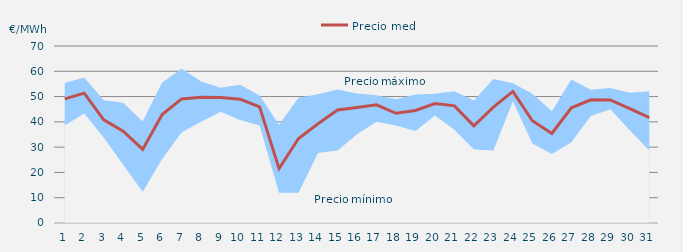
| Category | Precio medio |
|---|---|
| 1.0 | 49.1 |
| 2.0 | 51.364 |
| 3.0 | 40.78 |
| 4.0 | 36.286 |
| 5.0 | 29.111 |
| 6.0 | 42.871 |
| 7.0 | 49.083 |
| 8.0 | 49.733 |
| 9.0 | 49.644 |
| 10.0 | 48.979 |
| 11.0 | 45.943 |
| 12.0 | 21.513 |
| 13.0 | 33.439 |
| 14.0 | 39.231 |
| 15.0 | 44.69 |
| 16.0 | 45.666 |
| 17.0 | 46.754 |
| 18.0 | 43.381 |
| 19.0 | 44.503 |
| 20.0 | 47.212 |
| 21.0 | 46.318 |
| 22.0 | 38.448 |
| 23.0 | 45.802 |
| 24.0 | 52.036 |
| 25.0 | 40.442 |
| 26.0 | 35.396 |
| 27.0 | 45.564 |
| 28.0 | 48.697 |
| 29.0 | 48.676 |
| 30.0 | 45.194 |
| 31.0 | 41.657 |